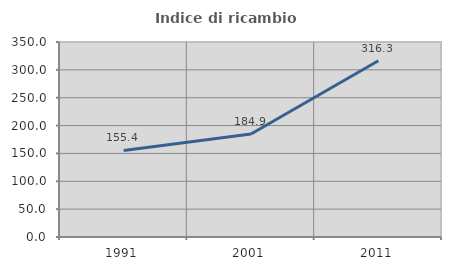
| Category | Indice di ricambio occupazionale  |
|---|---|
| 1991.0 | 155.405 |
| 2001.0 | 184.906 |
| 2011.0 | 316.279 |